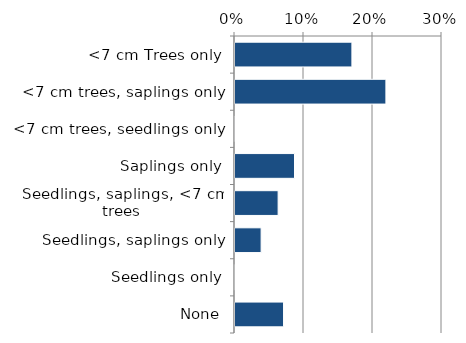
| Category | Non native |
|---|---|
| None | 0.072 |
| Seedlings only | 0 |
| Seedlings, saplings only | 0.039 |
| Seedlings, saplings, <7 cm trees | 0.064 |
| Saplings only | 0.088 |
| <7 cm trees, seedlings only | 0 |
| <7 cm trees, saplings only | 0.22 |
| <7 cm Trees only | 0.171 |